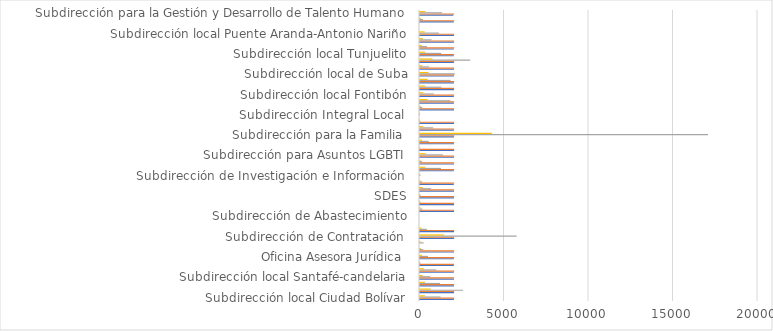
| Category | FECHAS EXTREMAS  | CANTIDAD DE CAJAS  | METROS LINEALES  |
|---|---|---|---|
| Subdirección local Ciudad Bolívar | 2020 | 1216 | 304 |
| Subdirección local Usme | 2020 | 2547 | 636.75 |
| Subdirección local Kennedy | 2020 | 1184 | 296 |
| Subdirección local Santafé-candelaria | 2020 | 613 | 153.25 |
| Subdirección local Bosa | 2020 | 965 | 241.25 |
| Secretaria  | 2010 | 23 | 5.75 |
| Oficina Asesora Jurídica  | 2020 | 470 | 117.5 |
| Oficina de Asuntos Disciplinarios  | 2021 | 196 | 49 |
| Subdirección de Plantas Físicas  | 0 | 214 | 53.5 |
| Subdirección de Contratación  | 2020 | 5721 | 1430.25 |
| Dirección de Nutrición y Abastecimiento  | 2021 | 407 | 101.75 |
| Subdirección de Nutrición | 0 | 0 | 0 |
| Subdirección de Abastecimiento | 0 | 0 | 0 |
| Dirección de Gestión Corporativa  | 2014 | 138 | 34.5 |
| Dirección de Análisis y Diseño estratégico  | 2017 | 26 | 6.5 |
| SDES | 2017 | 27 | 6.75 |
| Subdirección para la Infancia  | 2021 | 657 | 164.25 |
| Subdirección para la Identificación, Caracterización e Integración  | 2021 | 129 | 32.25 |
| Subdirección de Investigación e Información  | 0 | 38 | 9.5 |
| Subdirección para la Adultez  | 2021 | 1239 | 309.75 |
| Subdirección para la Juventud  | 2021 | 119 | 29.75 |
| Subdirección para Asuntos LGBTI  | 2021 | 1356 | 339 |
| Oficina de Control Interno  | 2021 | 6 | 1.5 |
| Subdirección administrativa y Financiera  | 2021 | 511 | 127.75 |
| Subdirección para la Familia  | 2021 | 17045 | 4261.25 |
| Subsecretaria  | 2021 | 778 | 194.5 |
| Dirección Territorial  | 2021 | 12 | 3 |
| Subdirección Integral Local  | 0 | 2 | 0.5 |
| Subdirección para la Vejez  | 2018 | 136 | 34 |
| Subdirección local Rafael Uribe | 2021 | 1797 | 449.25 |
| Subdirección local Fontibón | 2020 | 814 | 203.5 |
| Subdirección local Engativá | 2021 | 1266 | 316.5 |
| Subdirección local de Usaquén  | 2021 | 1809 | 452.25 |
| Subdirección local de Suba | 2021 | 2073 | 518.25 |
| Subdirección Barrios Unidos - Teusaquillo | 2021 | 538 | 134.5 |
| Subdirección local San Cristóbal  | 2021 | 2968 | 742 |
| Subdirección local Tunjuelito | 2021 | 1253 | 313.25 |
| Subdirección local Mártires | 2021 | 414 | 103.5 |
| Subdirección Local Chapinero | 2021 | 682 | 170.5 |
| Subdirección local Puente Aranda-Antonio Nariño | 2021 | 1117 | 279.25 |
| Oficina Asesora de Comunicaciones | 0 | 0 | 0 |
| Dirección Poblacional | 2019 | 180 | 45 |
| Subdirección para la Gestión y Desarrollo de Talento Humano | 2020 | 1302 | 325.5 |